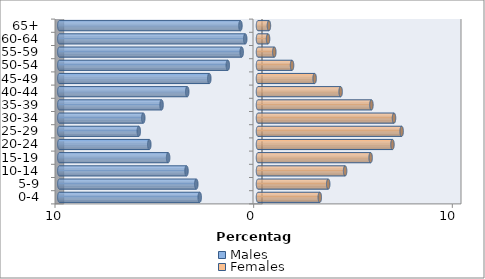
| Category | Males | Females |
|---|---|---|
| 0-4 | -2.934 | 3.111 |
| 5-9 | -3.106 | 3.535 |
| 10-14 | -3.599 | 4.385 |
| 15-19 | -4.524 | 5.67 |
| 20-24 | -5.471 | 6.768 |
| 25-29 | -6.001 | 7.23 |
| 30-34 | -5.775 | 6.846 |
| 35-39 | -4.855 | 5.709 |
| 40-44 | -3.562 | 4.16 |
| 45-49 | -2.451 | 2.851 |
| 50-54 | -1.52 | 1.714 |
| 55-59 | -0.821 | 0.821 |
| 60-64 | -0.643 | 0.506 |
| 65+ | -0.884 | 0.55 |